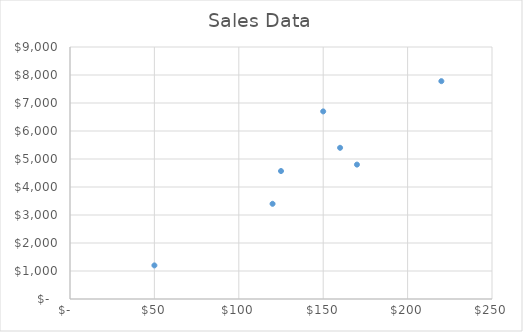
| Category | Series 0 |
|---|---|
| 150.0 | 6700 |
| 120.0 | 3400 |
| 50.0 | 1200 |
| 125.0 | 4570 |
| 220.0 | 7780 |
| 160.0 | 5400 |
| 170.0 | 4800 |